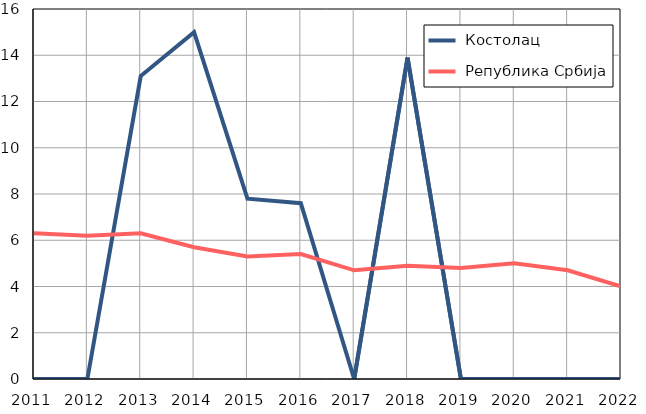
| Category |  Костолац |  Република Србија |
|---|---|---|
| 2011.0 | 0 | 6.3 |
| 2012.0 | 0 | 6.2 |
| 2013.0 | 13.1 | 6.3 |
| 2014.0 | 15 | 5.7 |
| 2015.0 | 7.8 | 5.3 |
| 2016.0 | 7.6 | 5.4 |
| 2017.0 | 0 | 4.7 |
| 2018.0 | 13.9 | 4.9 |
| 2019.0 | 0 | 4.8 |
| 2020.0 | 0 | 5 |
| 2021.0 | 0 | 4.7 |
| 2022.0 | 0 | 4 |